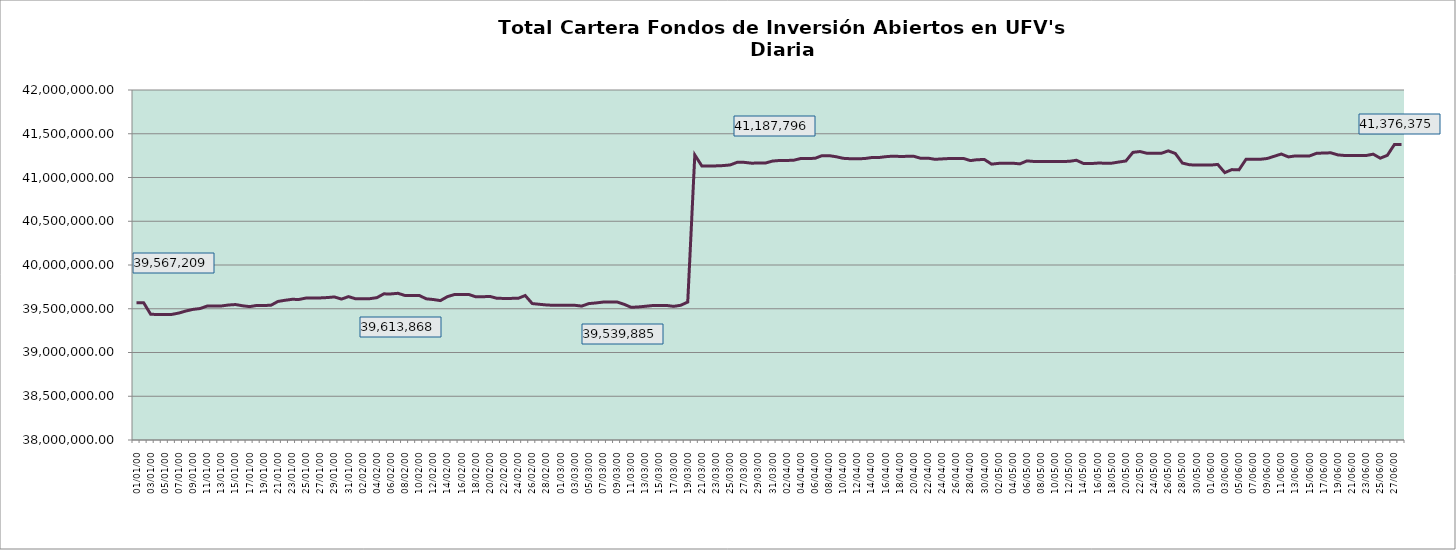
| Category | Cartera |
|---|---|
| 0 | 39567209.29 |
| 1900-01-01 | 39569472.86 |
| 1900-01-02 | 39437025.18 |
| 1900-01-03 | 39434121 |
| 1900-01-04 | 39434788.46 |
| 1900-01-05 | 39435454.53 |
| 1900-01-06 | 39451043.45 |
| 1900-01-07 | 39474726.92 |
| 1900-01-08 | 39492853.69 |
| 1900-01-09 | 39502385.43 |
| 1900-01-10 | 39531109.91 |
| 1900-01-11 | 39531464.58 |
| 1900-01-12 | 39531830.62 |
| 1900-01-13 | 39542561.8 |
| 1900-01-14 | 39548070.49 |
| 1900-01-15 | 39534058.19 |
| 1900-01-16 | 39524279.92 |
| 1900-01-17 | 39537733.82 |
| 1900-01-18 | 39538267.49 |
| 1900-01-19 | 39538804.73 |
| 1900-01-20 | 39583096.81 |
| 1900-01-21 | 39596574.58 |
| 1900-01-22 | 39607630.87 |
| 1900-01-23 | 39606414.19 |
| 1900-01-24 | 39622383.33 |
| 1900-01-25 | 39622970.2 |
| 1900-01-26 | 39623762.34 |
| 1900-01-27 | 39627822.64 |
| 1900-01-28 | 39634941.1 |
| 1900-01-29 | 39610482.94 |
| 1900-01-30 | 39638518.36 |
| 1900-01-31 | 39613868.48 |
| 1900-02-01 | 39614475.49 |
| 1900-02-02 | 39615084.51 |
| 1900-02-03 | 39626415.05 |
| 1900-02-04 | 39670127.73 |
| 1900-02-05 | 39669547.27 |
| 1900-02-06 | 39676569.97 |
| 1900-02-07 | 39651340.44 |
| 1900-02-08 | 39651729.6 |
| 1900-02-09 | 39652115.3 |
| 1900-02-10 | 39613498.9 |
| 1900-02-11 | 39605578.78 |
| 1900-02-12 | 39593026.41 |
| 1900-02-13 | 39638656.18 |
| 1900-02-14 | 39662752.57 |
| 1900-02-15 | 39663138.64 |
| 1900-02-16 | 39663528.47 |
| 1900-02-17 | 39636700.05 |
| 1900-02-18 | 39637108.15 |
| 1900-02-19 | 39641201.2 |
| 1900-02-20 | 39619387.93 |
| 1900-02-21 | 39618126.15 |
| 1900-02-22 | 39618517.67 |
| 1900-02-23 | 39618912.79 |
| 1900-02-24 | 39651098.69 |
| 1900-02-25 | 39559173.77 |
| 1900-02-26 | 39550956.62 |
| 1900-02-27 | 39543363.84 |
| 1900-02-28 | 39539208.13 |
| 1900-02-28 | 39539544.7 |
| 1900-03-01 | 39539885.05 |
| 1900-03-02 | 39539701.77 |
| 1900-03-03 | 39530248.95 |
| 1900-03-04 | 39558869.01 |
| 1900-03-05 | 39566250.12 |
| 1900-03-06 | 39576182.68 |
| 1900-03-07 | 39576527.28 |
| 1900-03-08 | 39577212.85 |
| 1900-03-09 | 39550486.38 |
| 1900-03-10 | 39516225.75 |
| 1900-03-11 | 39520459.85 |
| 1900-03-12 | 39528207.78 |
| 1900-03-13 | 39536456.89 |
| 1900-03-14 | 39537155.97 |
| 1900-03-15 | 39537851.91 |
| 1900-03-16 | 39527188.02 |
| 1900-03-17 | 39539638.95 |
| 1900-03-18 | 39576377.57 |
| 1900-03-19 | 41257655.66 |
| 1900-03-20 | 41131115.52 |
| 1900-03-21 | 41131942.46 |
| 1900-03-22 | 41132740.48 |
| 1900-03-23 | 41136089.91 |
| 1900-03-24 | 41143461 |
| 1900-03-25 | 41173636.97 |
| 1900-03-26 | 41172878.4 |
| 1900-03-27 | 41164018.39 |
| 1900-03-28 | 41164715.86 |
| 1900-03-29 | 41165417.89 |
| 1900-03-30 | 41187795.81 |
| 1900-03-31 | 41194623.18 |
| 1900-04-01 | 41194610.24 |
| 1900-04-02 | 41197515.44 |
| 1900-04-03 | 41217204.29 |
| 1900-04-04 | 41218028.62 |
| 1900-04-05 | 41218834.21 |
| 1900-04-06 | 41249658.37 |
| 1900-04-07 | 41249599.68 |
| 1900-04-08 | 41237430.64 |
| 1900-04-09 | 41219103.13 |
| 1900-04-10 | 41214683.25 |
| 1900-04-11 | 41215281.71 |
| 1900-04-12 | 41215862.63 |
| 1900-04-13 | 41227773.76 |
| 1900-04-14 | 41227659.07 |
| 1900-04-15 | 41237794.49 |
| 1900-04-16 | 41243870.62 |
| 1900-04-17 | 41240782.54 |
| 1900-04-18 | 41241591.19 |
| 1900-04-19 | 41242219.18 |
| 1900-04-20 | 41218804.7 |
| 1900-04-21 | 41220869.7 |
| 1900-04-22 | 41207853.4 |
| 1900-04-23 | 41212499.74 |
| 1900-04-24 | 41216955.98 |
| 1900-04-25 | 41217685.68 |
| 1900-04-26 | 41218411.37 |
| 1900-04-27 | 41193111.08 |
| 1900-04-28 | 41204041.7 |
| 1900-04-29 | 41204618.64 |
| 1900-04-30 | 41152662.44 |
| 1900-05-01 | 41161512.77 |
| 1900-05-02 | 41162605.63 |
| 1900-05-03 | 41163345.55 |
| 1900-05-04 | 41155674.3 |
| 1900-05-05 | 41189662.98 |
| 1900-05-06 | 41183151.1 |
| 1900-05-07 | 41183800.13 |
| 1900-05-08 | 41183727.99 |
| 1900-05-09 | 41183496.91 |
| 1900-05-10 | 41183276.45 |
| 1900-05-11 | 41184772.3 |
| 1900-05-12 | 41196953.7 |
| 1900-05-13 | 41160510.38 |
| 1900-05-14 | 41158800.74 |
| 1900-05-15 | 41164467.33 |
| 1900-05-16 | 41164108.33 |
| 1900-05-17 | 41163759.97 |
| 1900-05-18 | 41176825.95 |
| 1900-05-19 | 41188745.45 |
| 1900-05-20 | 41287342.79 |
| 1900-05-21 | 41296697.42 |
| 1900-05-22 | 41276479.97 |
| 1900-05-23 | 41276329.92 |
| 1900-05-24 | 41276163.19 |
| 1900-05-25 | 41304359.63 |
| 1900-05-26 | 41274506.44 |
| 1900-05-27 | 41164960.79 |
| 1900-05-28 | 41145598.5 |
| 1900-05-29 | 41141440.78 |
| 1900-05-30 | 41141531.2 |
| 1900-05-31 | 41141615.01 |
| 1900-06-01 | 41149487.45 |
| 1900-06-02 | 41055840.35 |
| 1900-06-03 | 41090273.02 |
| 1900-06-04 | 41087234.84 |
| 1900-06-05 | 41207752.29 |
| 1900-06-06 | 41208245.55 |
| 1900-06-07 | 41207885.41 |
| 1900-06-08 | 41217169.16 |
| 1900-06-09 | 41242841.79 |
| 1900-06-10 | 41268390.24 |
| 1900-06-11 | 41235322.3 |
| 1900-06-12 | 41246865.82 |
| 1900-06-13 | 41246846.62 |
| 1900-06-14 | 41246827.75 |
| 1900-06-15 | 41276898.29 |
| 1900-06-16 | 41279560.11 |
| 1900-06-17 | 41282280.43 |
| 1900-06-18 | 41258305.32 |
| 1900-06-19 | 41251286.76 |
| 1900-06-20 | 41251204.15 |
| 1900-06-21 | 41251104.86 |
| 1900-06-22 | 41251022.8 |
| 1900-06-23 | 41266835.28 |
| 1900-06-24 | 41220698.7 |
| 1900-06-25 | 41253299.12 |
| 1900-06-26 | 41376655.7 |
| 1900-06-27 | 41376374.99 |